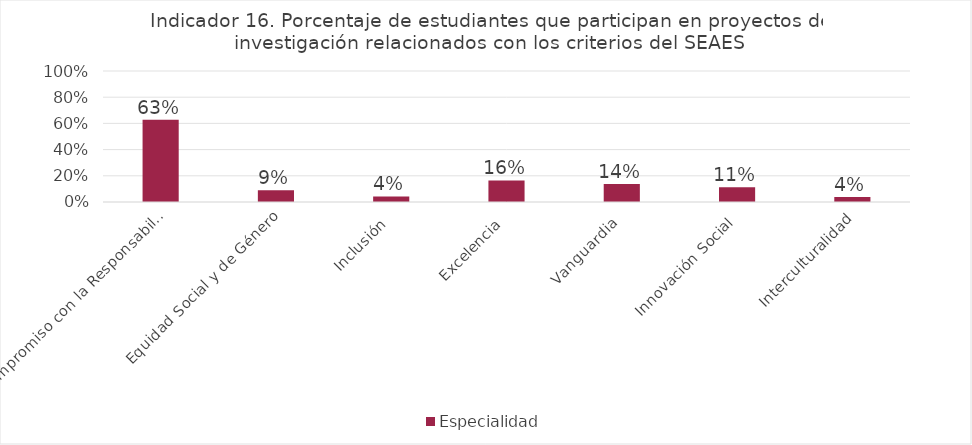
| Category | Especialidad |
|---|---|
| Compromiso con la Responsabilidad Social | 0.628 |
| Equidad Social y de Género | 0.09 |
| Inclusión | 0.043 |
| Excelencia | 0.165 |
| Vanguardia | 0.138 |
| Innovación Social | 0.112 |
| Interculturalidad | 0.037 |